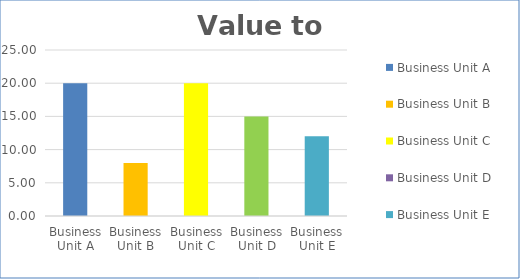
| Category | Business Unit A | Business Unit B | Business Unit C | Business Unit D | Business Unit E |
|---|---|---|---|---|---|
| Business Unit A | 20 | 0 | 0 | 0 | 0 |
| Business Unit B | 0 | 8 | 0 | 0 | 0 |
| Business Unit C | 0 | 0 | 20 | 0 | 0 |
| Business Unit D | 0 | 0 | 0 | 15 | 0 |
| Business Unit E | 0 | 0 | 0 | 0 | 12 |